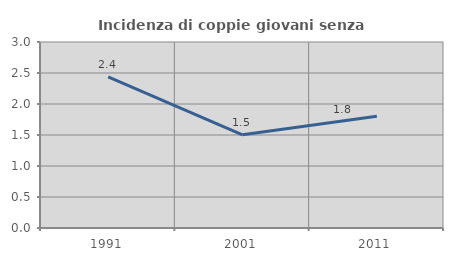
| Category | Incidenza di coppie giovani senza figli |
|---|---|
| 1991.0 | 2.439 |
| 2001.0 | 1.504 |
| 2011.0 | 1.802 |